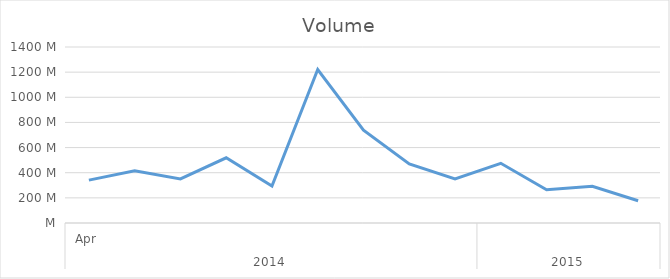
| Category | Total |
|---|---|
| 0 | 340847700 |
| 1 | 414766700 |
| 2 | 350662000 |
| 3 | 518701600 |
| 4 | 293222000 |
| 5 | 1220435700 |
| 6 | 738416400 |
| 7 | 470123300 |
| 8 | 349931000 |
| 9 | 475058700 |
| 10 | 265059900 |
| 11 | 291951300 |
| 12 | 176735300 |